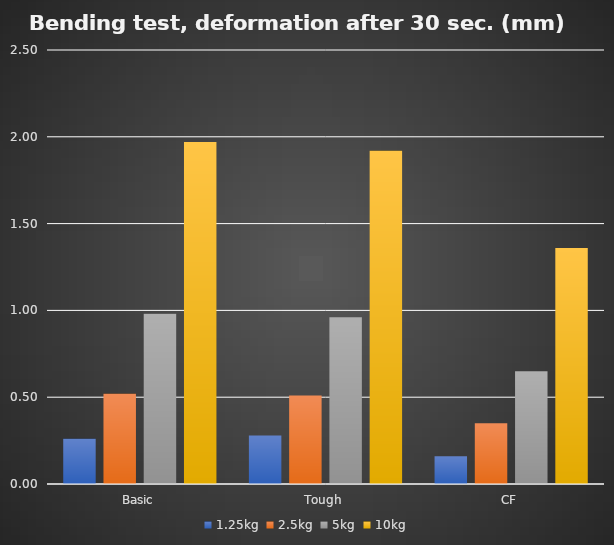
| Category | 1.25kg | 2.5kg | 5kg | 10kg |
|---|---|---|---|---|
| Basic | 0.26 | 0.52 | 0.98 | 1.97 |
| Tough | 0.28 | 0.51 | 0.96 | 1.92 |
| CF | 0.16 | 0.35 | 0.65 | 1.36 |